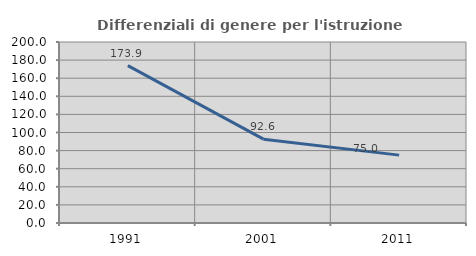
| Category | Differenziali di genere per l'istruzione superiore |
|---|---|
| 1991.0 | 173.913 |
| 2001.0 | 92.647 |
| 2011.0 | 75 |